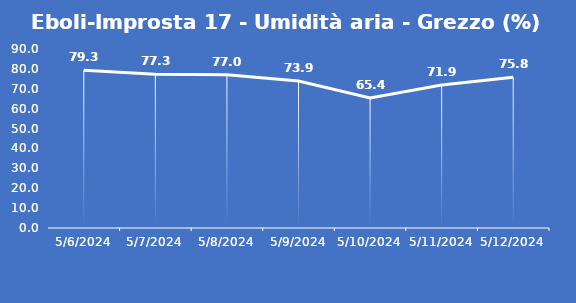
| Category | Eboli-Improsta 17 - Umidità aria - Grezzo (%) |
|---|---|
| 5/6/24 | 79.3 |
| 5/7/24 | 77.3 |
| 5/8/24 | 77 |
| 5/9/24 | 73.9 |
| 5/10/24 | 65.4 |
| 5/11/24 | 71.9 |
| 5/12/24 | 75.8 |